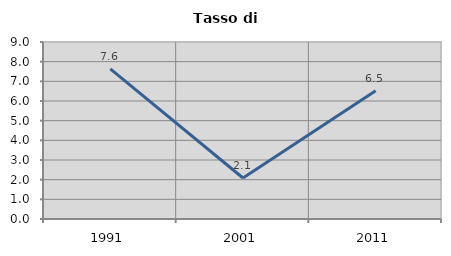
| Category | Tasso di disoccupazione   |
|---|---|
| 1991.0 | 7.634 |
| 2001.0 | 2.083 |
| 2011.0 | 6.522 |